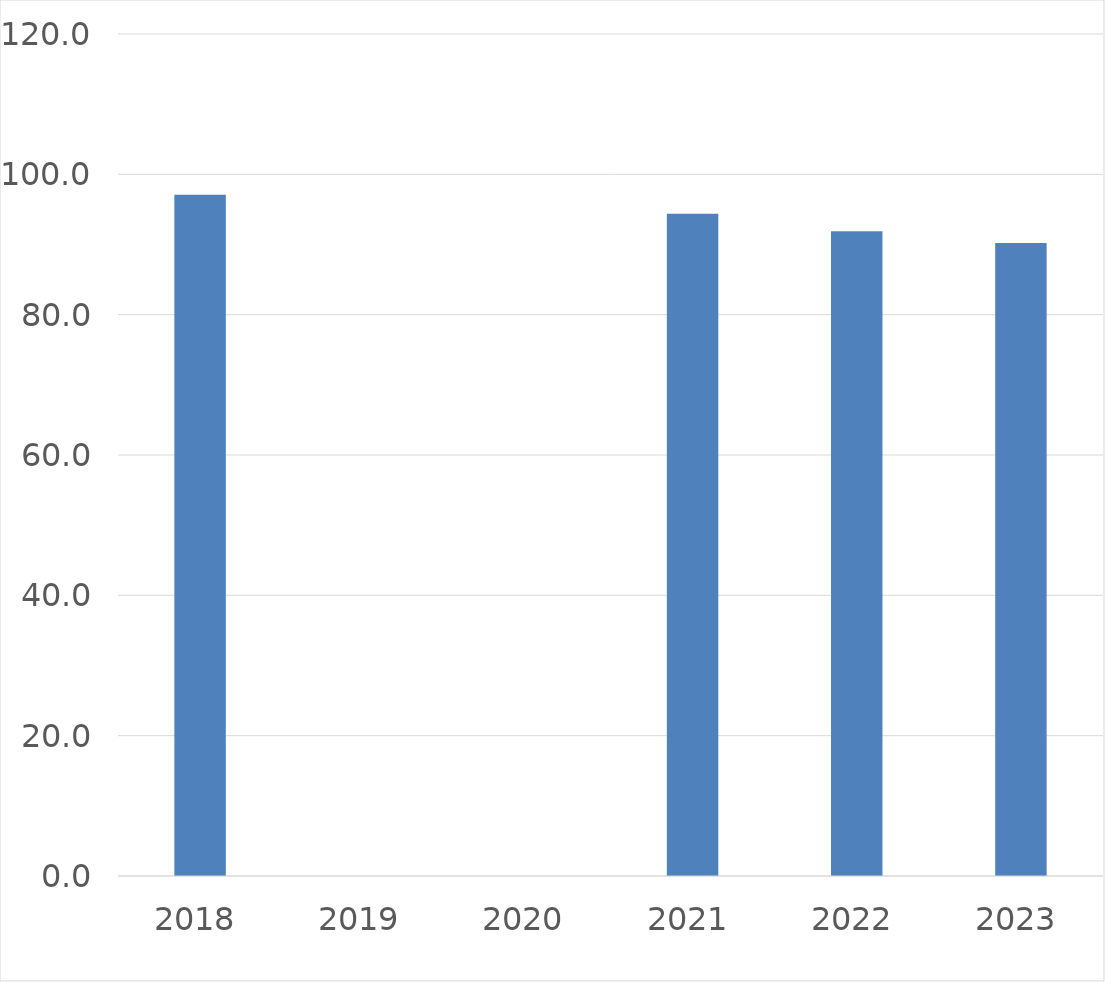
| Category | Series 0 |
|---|---|
| 2018 | 97.1 |
| 2019 | 0 |
| 2020 | 0 |
| 2021 | 94.4 |
| 2022 | 91.9 |
| 2023 | 90.2 |